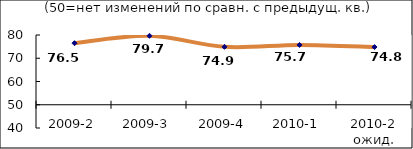
| Category | Диф.индекс ↓ |
|---|---|
| 2009-2 | 76.485 |
| 2009-3 | 79.66 |
| 2009-4 | 74.905 |
| 2010-1 | 75.725 |
| 2010-2 ожид. | 74.815 |